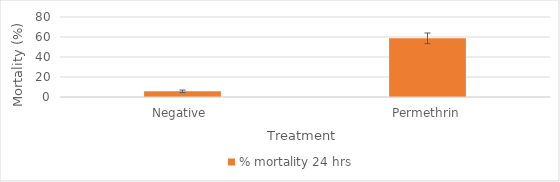
| Category | % mortality 24 hrs |
|---|---|
| Negative  | 5.66 |
| Permethrin | 58.654 |